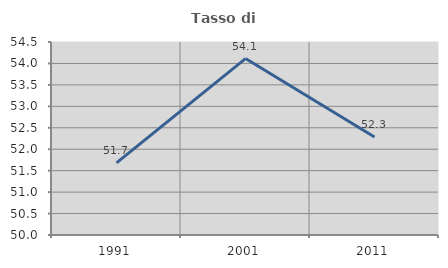
| Category | Tasso di occupazione   |
|---|---|
| 1991.0 | 51.68 |
| 2001.0 | 54.113 |
| 2011.0 | 52.284 |